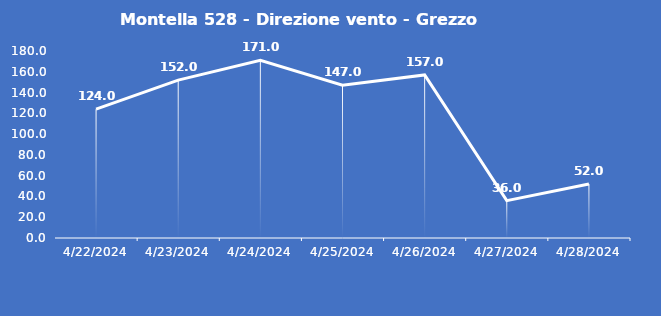
| Category | Montella 528 - Direzione vento - Grezzo (°N) |
|---|---|
| 4/22/24 | 124 |
| 4/23/24 | 152 |
| 4/24/24 | 171 |
| 4/25/24 | 147 |
| 4/26/24 | 157 |
| 4/27/24 | 36 |
| 4/28/24 | 52 |